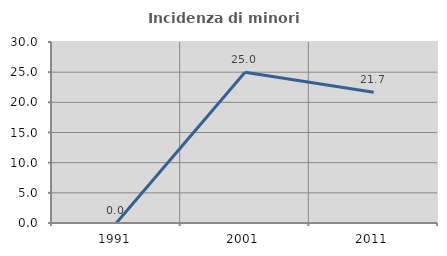
| Category | Incidenza di minori stranieri |
|---|---|
| 1991.0 | 0 |
| 2001.0 | 25 |
| 2011.0 | 21.667 |